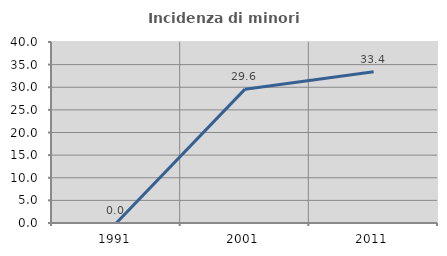
| Category | Incidenza di minori stranieri |
|---|---|
| 1991.0 | 0 |
| 2001.0 | 29.577 |
| 2011.0 | 33.437 |